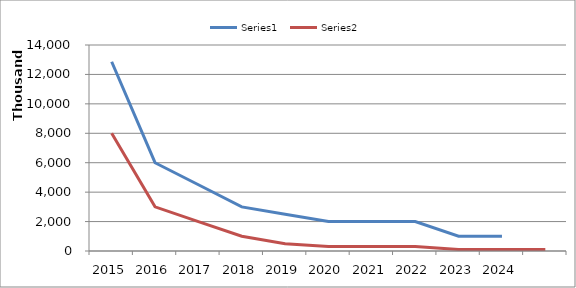
| Category | Series 0 | Series 1 |
|---|---|---|
| 2015.0 | 12861000 | 8008000 |
| 2016.0 | 6000000 | 3000000 |
| 2017.0 | 4500000 | 2000000 |
| 2018.0 | 3000000 | 1000000 |
| 2019.0 | 2500000 | 500000 |
| 2020.0 | 2000000 | 300000 |
| 2021.0 | 2000000 | 300000 |
| 2022.0 | 2000000 | 300000 |
| 2023.0 | 1000000 | 100000 |
| 2024.0 | 1000000 | 100000 |